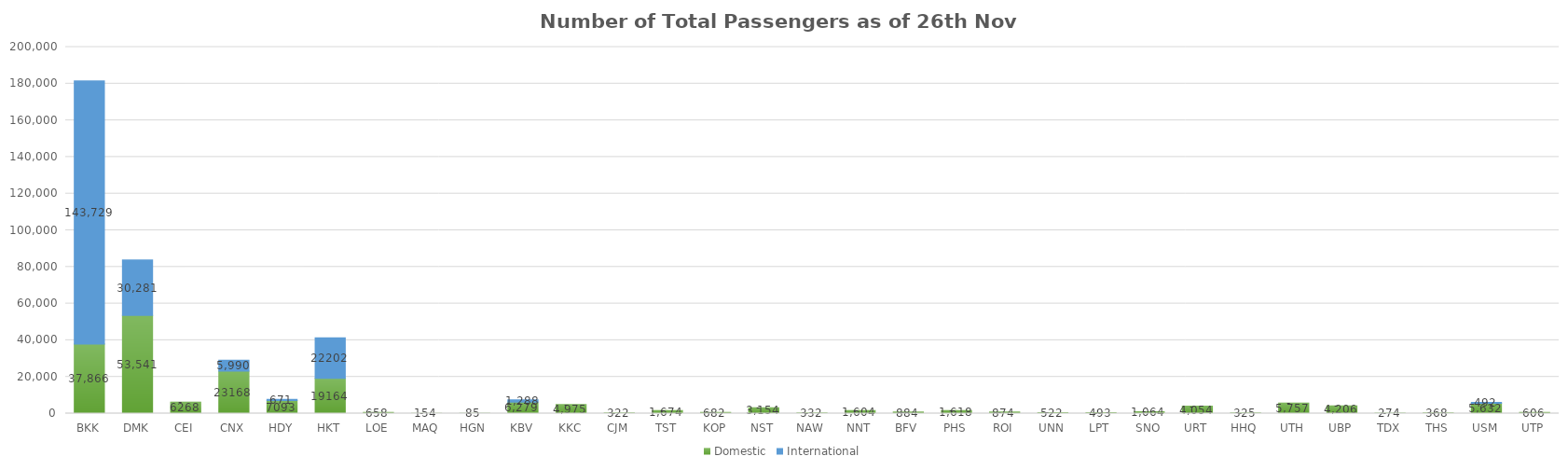
| Category | Domestic | International |
|---|---|---|
| BKK | 37866 | 143729 |
| DMK | 53541 | 30281 |
| CEI | 6268 | 0 |
| CNX | 23168 | 5990 |
| HDY | 7093 | 671 |
| HKT | 19164 | 22202 |
| LOE | 658 | 0 |
| MAQ | 154 | 0 |
| HGN | 85 | 0 |
| KBV | 6279 | 1288 |
| KKC | 4975 | 0 |
| CJM | 322 | 0 |
| TST | 1674 | 0 |
| KOP | 682 | 0 |
| NST | 3154 | 0 |
| NAW | 332 | 0 |
| NNT | 1604 | 0 |
| BFV | 884 | 0 |
| PHS | 1618 | 0 |
| ROI | 874 | 0 |
| UNN | 522 | 0 |
| LPT | 493 | 0 |
| SNO | 1064 | 0 |
| URT | 4054 | 0 |
| HHQ | 325 | 0 |
| UTH | 5757 | 0 |
| UBP | 4206 | 0 |
| TDX | 274 | 0 |
| THS | 368 | 0 |
| USM | 5632 | 492 |
| UTP | 606 | 0 |